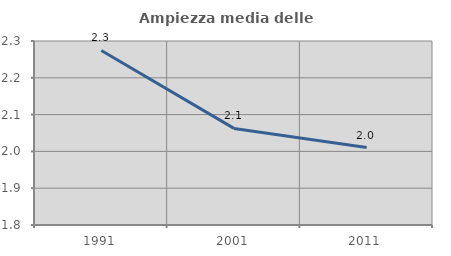
| Category | Ampiezza media delle famiglie |
|---|---|
| 1991.0 | 2.274 |
| 2001.0 | 2.062 |
| 2011.0 | 2.01 |